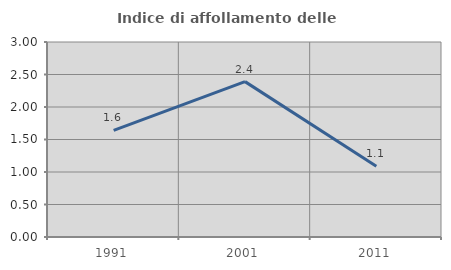
| Category | Indice di affollamento delle abitazioni  |
|---|---|
| 1991.0 | 1.639 |
| 2001.0 | 2.39 |
| 2011.0 | 1.087 |